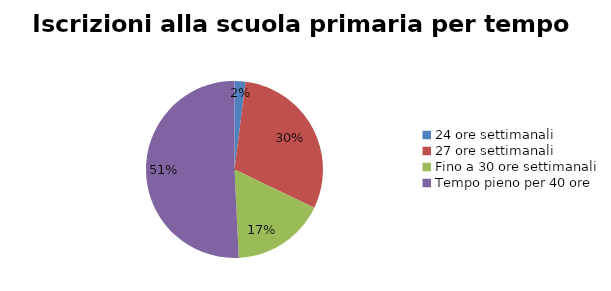
| Category | Series 0 |
|---|---|
| 24 ore settimanali | 808 |
| 27 ore settimanali | 12169 |
| Fino a 30 ore settimanali | 6908 |
| Tempo pieno per 40 ore | 20505 |